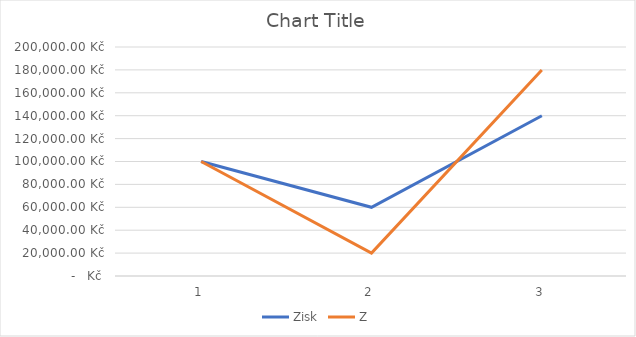
| Category |  Zisk  |  Z  |
|---|---|---|
| 0 | 100000 | 100000 |
| 1 | 60000 | 20000 |
| 2 | 140000 | 180000 |